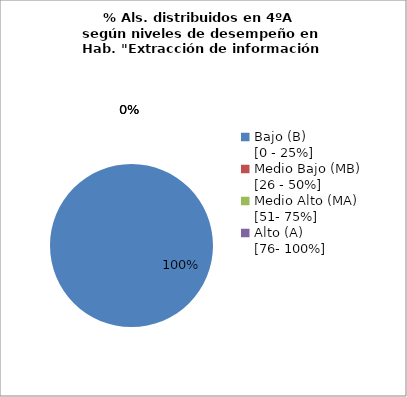
| Category | Series 0 |
|---|---|
| Bajo (B)                 [0 - 25%] | 1 |
| Medio Bajo (MB)  [26 - 50%] | 0 |
| Medio Alto (MA)   [51- 75%] | 0 |
| Alto (A)              [76- 100%] | 0 |